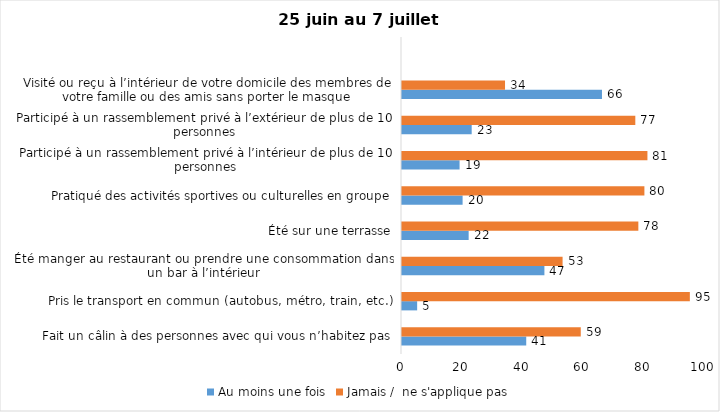
| Category | Au moins une fois | Jamais /  ne s'applique pas |
|---|---|---|
| Fait un câlin à des personnes avec qui vous n’habitez pas | 41 | 59 |
| Pris le transport en commun (autobus, métro, train, etc.) | 5 | 95 |
| Été manger au restaurant ou prendre une consommation dans un bar à l’intérieur | 47 | 53 |
| Été sur une terrasse | 22 | 78 |
| Pratiqué des activités sportives ou culturelles en groupe | 20 | 80 |
| Participé à un rassemblement privé à l’intérieur de plus de 10 personnes | 19 | 81 |
| Participé à un rassemblement privé à l’extérieur de plus de 10 personnes | 23 | 77 |
| Visité ou reçu à l’intérieur de votre domicile des membres de votre famille ou des amis sans porter le masque | 66 | 34 |